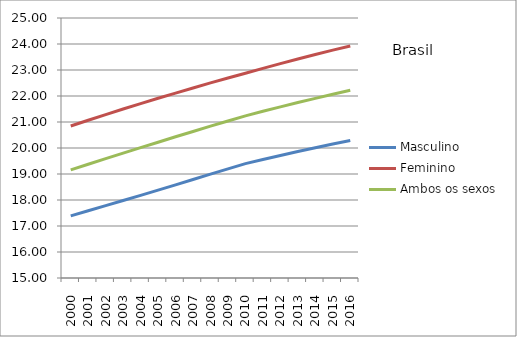
| Category | Masculino | Feminino | Ambos os sexos |
|---|---|---|---|
| 2000.0 | 17.389 | 20.845 | 19.158 |
| 2001.0 | 17.586 | 21.068 | 19.376 |
| 2002.0 | 17.783 | 21.285 | 19.59 |
| 2003.0 | 17.981 | 21.498 | 19.803 |
| 2004.0 | 18.18 | 21.707 | 20.013 |
| 2005.0 | 18.38 | 21.912 | 20.223 |
| 2006.0 | 18.584 | 22.113 | 20.431 |
| 2007.0 | 18.788 | 22.31 | 20.637 |
| 2008.0 | 18.993 | 22.503 | 20.84 |
| 2009.0 | 19.197 | 22.692 | 21.041 |
| 2010.0 | 19.398 | 22.877 | 21.238 |
| 2011.0 | 19.557 | 23.064 | 21.412 |
| 2012.0 | 19.712 | 23.246 | 21.583 |
| 2013.0 | 19.863 | 23.423 | 21.748 |
| 2014.0 | 20.01 | 23.596 | 21.909 |
| 2015.0 | 20.153 | 23.763 | 22.066 |
| 2016.0 | 20.292 | 23.926 | 22.218 |